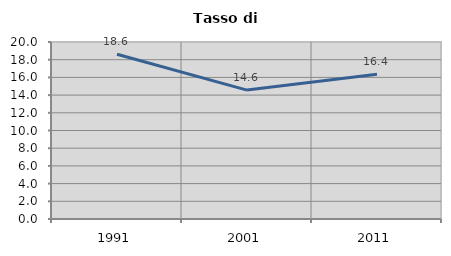
| Category | Tasso di disoccupazione   |
|---|---|
| 1991.0 | 18.608 |
| 2001.0 | 14.568 |
| 2011.0 | 16.369 |